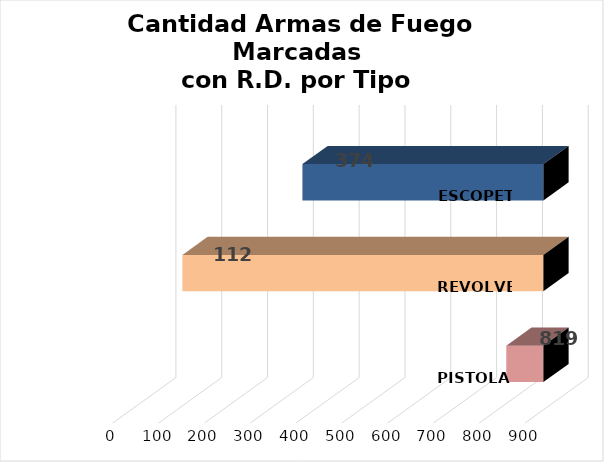
| Category | Series 0 |
|---|---|
| PISTOLA | 819 |
| REVOLVER | 112 |
| ESCOPETA | 374 |